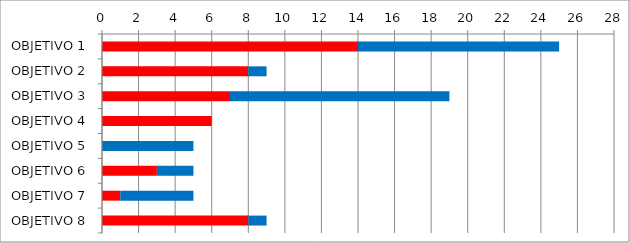
| Category | Series 0 | Series 3 | Series 1 |
|---|---|---|---|
| OBJETIVO 1 | 14 | 0 | 11 |
| OBJETIVO 2 | 8 | 0 | 1 |
| OBJETIVO 3 | 7 | 0 | 12 |
| OBJETIVO 4 | 6 | 0 | 0 |
| OBJETIVO 5 | 0 | 0 | 5 |
| OBJETIVO 6 | 3 | 0 | 2 |
| OBJETIVO 7 | 1 | 0 | 4 |
| OBJETIVO 8 | 8 | 0 | 1 |